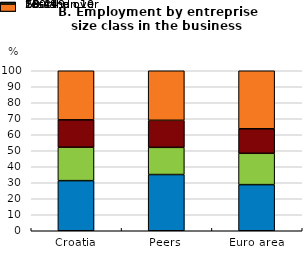
| Category | Less than 10 | 10-49 | 50-249 | 250 and over |
|---|---|---|---|---|
| Croatia | 31.313 | 20.908 | 17.109 | 30.67 |
| Peers | 35.127 | 16.997 | 16.913 | 30.963 |
| Euro area | 28.825 | 19.59 | 15.319 | 36.267 |